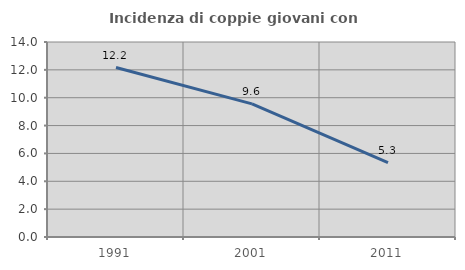
| Category | Incidenza di coppie giovani con figli |
|---|---|
| 1991.0 | 12.165 |
| 2001.0 | 9.556 |
| 2011.0 | 5.337 |